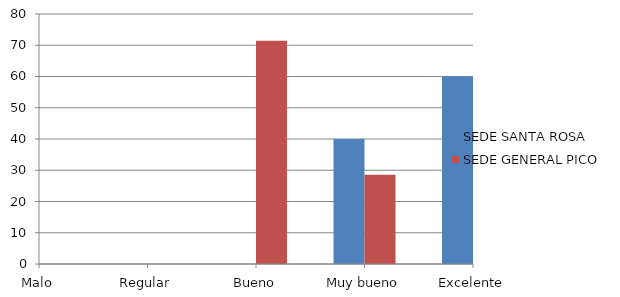
| Category | SEDE SANTA ROSA | SEDE GENERAL PICO |
|---|---|---|
| Malo | 0 | 0 |
| Regular | 0 | 0 |
| Bueno | 0 | 71.4 |
| Muy bueno | 40 | 28.6 |
| Excelente | 60 | 0 |